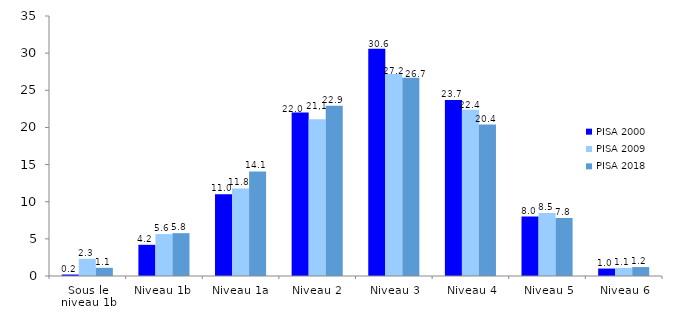
| Category | PISA 2000 | PISA 2009 | PISA 2018 |
|---|---|---|---|
| Sous le niveau 1b | 0.2 | 2.32 | 1.101 |
| Niveau 1b | 4.2 | 5.641 | 5.766 |
| Niveau 1a | 11 | 11.791 | 14.079 |
| Niveau 2 | 22 | 21.096 | 22.903 |
| Niveau 3
 | 30.6 | 27.206 | 26.693 |
| Niveau 4
 | 23.7 | 22.38 | 20.393 |
| Niveau 5
 | 8 | 8.475 | 7.812 |
| Niveau 6
 | 1 | 1.09 | 1.203 |